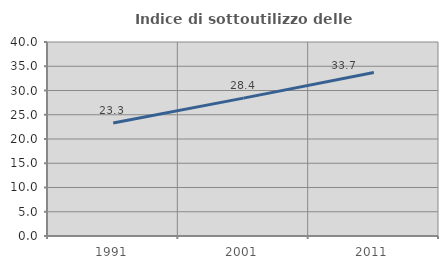
| Category | Indice di sottoutilizzo delle abitazioni  |
|---|---|
| 1991.0 | 23.298 |
| 2001.0 | 28.432 |
| 2011.0 | 33.728 |